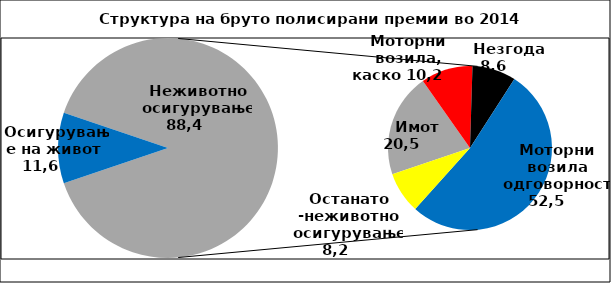
| Category | Series 0 |
|---|---|
| 0 | 11.6 |
| 1 | 20.451 |
| 2 | 10.233 |
| 3 | 8.616 |
| 4 | 52.543 |
| 5 | 8.157 |